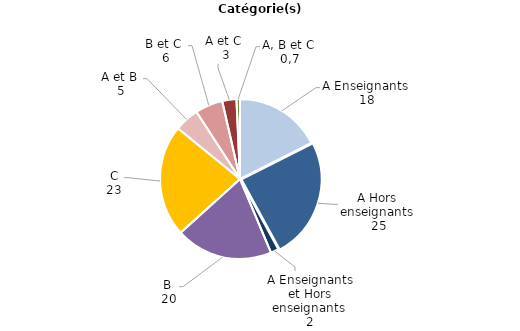
| Category | Series 0 |
|---|---|
| A Enseignants | 17.549 |
| A Hors enseignants | 24.504 |
| A Enseignants et Hors enseignants | 1.604 |
| B | 19.648 |
| C | 22.574 |
| A et B | 4.951 |
| B et C | 5.587 |
| A et C | 2.877 |
| A, B et C | 0.705 |